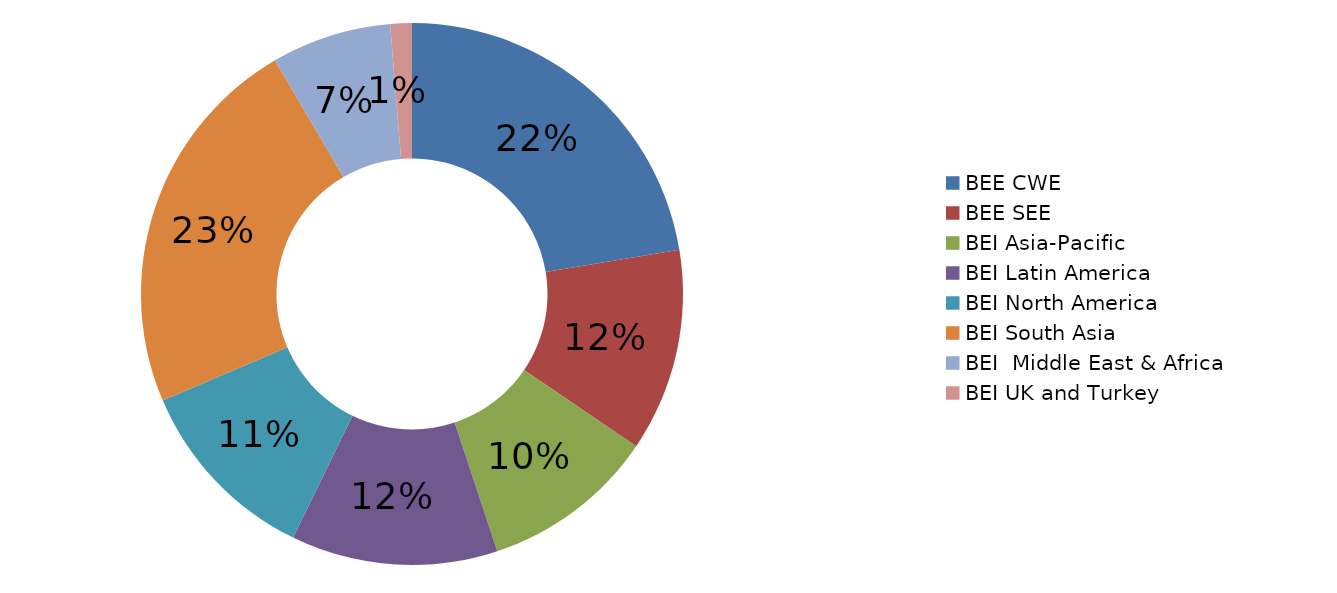
| Category | Total |
|---|---|
| 0 | 25762.718 |
| 1 | 13921.644 |
| 2 | 11981.732 |
| 3 | 14180.382 |
| 4 | 13055.624 |
| 5 | 26445.206 |
| 6 | 8227.85 |
| 7 | 1481.216 |